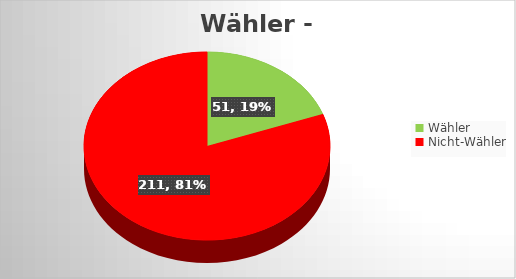
| Category | Series 0 |
|---|---|
| Wähler | 51 |
| Nicht-Wähler | 211 |